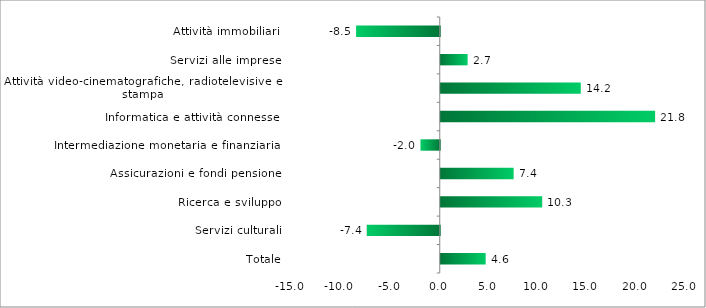
| Category | Series 0 |
|---|---|
| Attività immobiliari | -8.494 |
| Servizi alle imprese | 2.73 |
| Attività video-cinematografiche, radiotelevisive e stampa | 14.215 |
| Informatica e attività connesse | 21.76 |
| Intermediazione monetaria e finanziaria | -1.956 |
| Assicurazioni e fondi pensione | 7.4 |
| Ricerca e sviluppo | 10.296 |
| Servizi culturali | -7.408 |
| Totale | 4.56 |